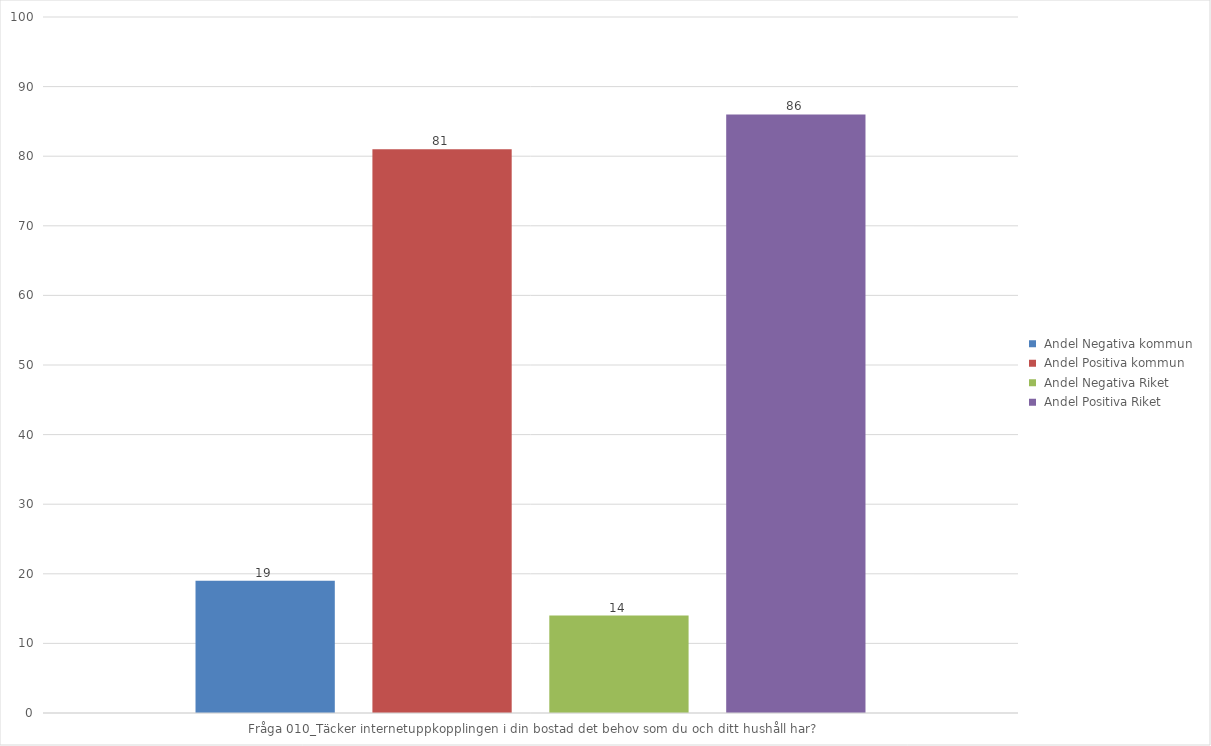
| Category |  Andel Negativa kommun |  Andel Positiva kommun |  Andel Negativa Riket |  Andel Positiva Riket |
|---|---|---|---|---|
| Fråga 010_Täcker internetuppkopplingen i din bostad det behov som du och ditt hushåll har? | 19 | 81 | 14 | 86 |